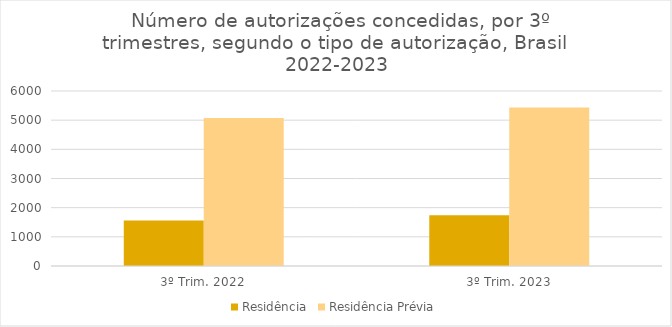
| Category | Residência | Residência Prévia |
|---|---|---|
| 3º Trim. 2022 | 1562 | 5075 |
| 3º Trim. 2023 | 1742 | 5437 |